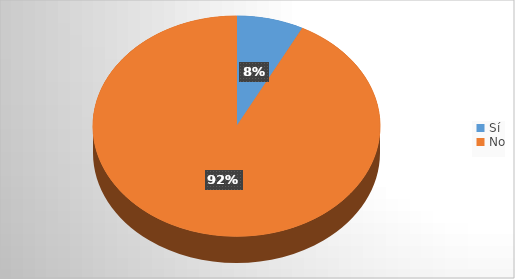
| Category | Series 0 |
|---|---|
| Sí | 4 |
| No | 49 |